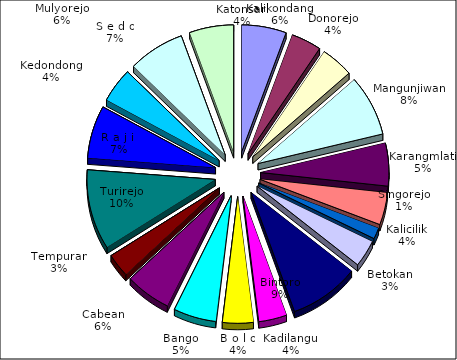
| Category | Series 0 |
|---|---|
| Kalikondang | 3.46 |
| Donorejo | 2.33 |
| Katonsari | 2.52 |
| Mangunjiwan | 4.77 |
| Karangmlati | 3.37 |
| Kalicilik | 2.52 |
| Singorejo | 0.87 |
| Betokan | 2.12 |
| Bintoro | 5.43 |
| Kadilangu | 2.18 |
| B o l o | 2.39 |
| Bango | 3.3 |
| Cabean | 3.54 |
| Tempuran | 1.84 |
| Turirejo | 6.28 |
| R a j i  | 4.14 |
| Kedondong | 2.71 |
| S e d o | 4.37 |
| Mulyorejo | 3.42 |